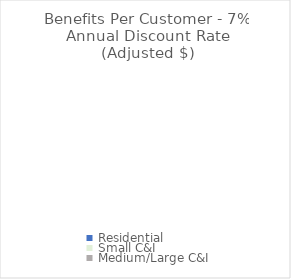
| Category | Benefit Per Customer - 7% Annual Discount Rate (Adjusted $/Customer) |
|---|---|
| Residential | 0 |
| Small C&I | 0 |
| Medium/Large C&I | 0 |